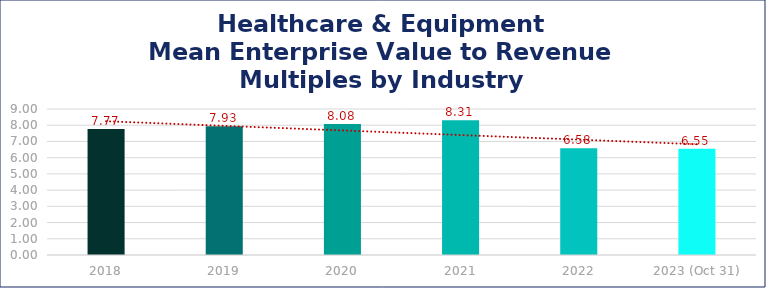
| Category | Healthcare & Equipment |
|---|---|
| 2018 | 7.77 |
| 2019 | 7.93 |
| 2020 | 8.08 |
| 2021 | 8.31 |
| 2022 | 6.58 |
| 2023 (Oct 31) | 6.55 |